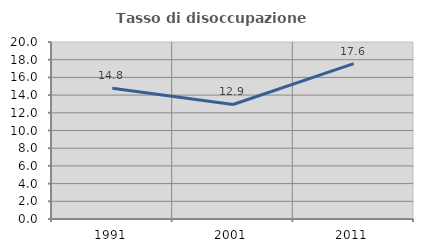
| Category | Tasso di disoccupazione giovanile  |
|---|---|
| 1991.0 | 14.767 |
| 2001.0 | 12.941 |
| 2011.0 | 17.563 |